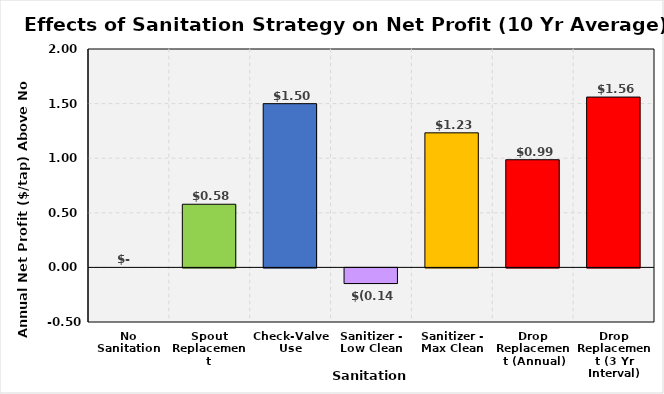
| Category | Series 0 |
|---|---|
| No Sanitation | 0 |
| Spout Replacement | 0.578 |
| Check-Valve Use | 1.499 |
| Sanitizer - Low Clean | -0.143 |
| Sanitizer - Max Clean | 1.232 |
| Drop Replacement (Annual) | 0.986 |
| Drop Replacement (3 Yr Interval) | 1.56 |